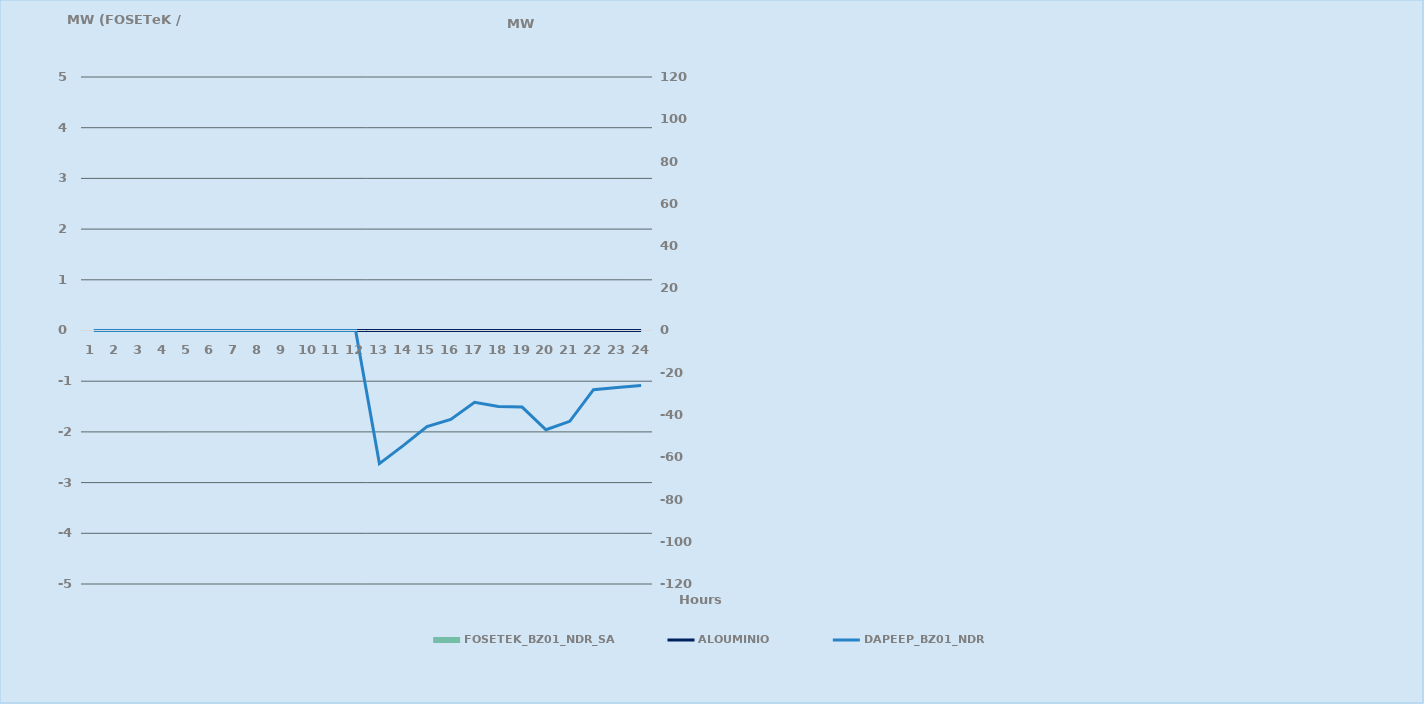
| Category | FOSETEK_BZ01_NDR_SA |
|---|---|
| 0 | 0 |
| 1 | 0 |
| 2 | 0 |
| 3 | 0 |
| 4 | 0 |
| 5 | 0 |
| 6 | 0 |
| 7 | 0 |
| 8 | 0 |
| 9 | 0 |
| 10 | 0 |
| 11 | 0 |
| 12 | 0 |
| 13 | 0 |
| 14 | 0 |
| 15 | 0 |
| 16 | 0 |
| 17 | 0 |
| 18 | 0 |
| 19 | 0 |
| 20 | 0 |
| 21 | 0 |
| 22 | 0 |
| 23 | 0 |